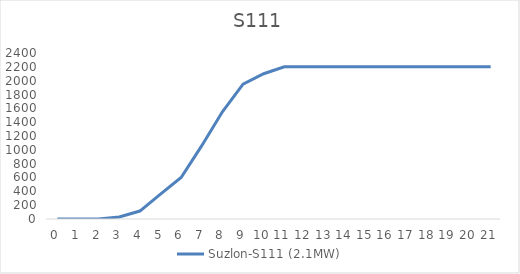
| Category | Suzlon-S111 (2.1MW) |
|---|---|
| 0.0 | 0 |
| 1.0 | 0 |
| 2.0 | 0 |
| 3.0 | 30 |
| 4.0 | 115 |
| 5.0 | 360 |
| 6.0 | 600 |
| 7.0 | 1060 |
| 8.0 | 1550 |
| 9.0 | 1950 |
| 10.0 | 2100 |
| 11.0 | 2200 |
| 12.0 | 2200 |
| 13.0 | 2200 |
| 14.0 | 2200 |
| 15.0 | 2200 |
| 16.0 | 2200 |
| 17.0 | 2200 |
| 18.0 | 2200 |
| 19.0 | 2200 |
| 20.0 | 2200 |
| 21.0 | 2200 |